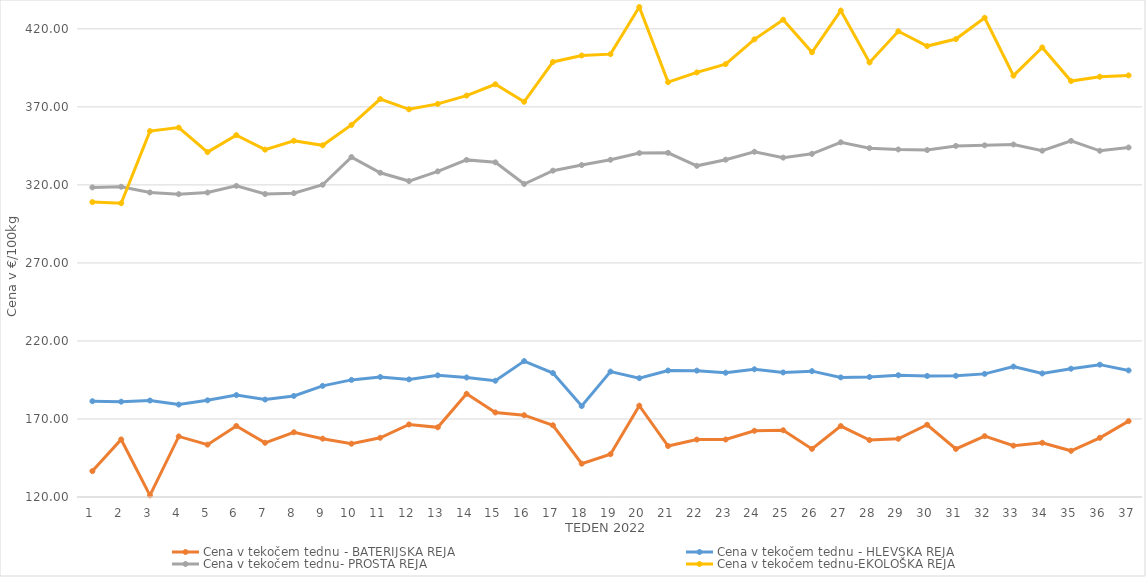
| Category | Cena v tekočem tednu - BATERIJSKA REJA | Cena v tekočem tednu - HLEVSKA REJA | Cena v tekočem tednu- PROSTA REJA | Cena v tekočem tednu-EKOLOŠKA REJA |
|---|---|---|---|---|
| 1.0 | 136.59 | 181.38 | 318.4 | 308.97 |
| 2.0 | 156.88 | 181.07 | 318.82 | 308.28 |
| 3.0 | 121.07 | 181.83 | 315.14 | 354.48 |
| 4.0 | 158.82 | 179.22 | 314.08 | 356.72 |
| 5.0 | 153.55 | 181.96 | 315.1 | 341.03 |
| 6.0 | 165.51 | 185.31 | 319.38 | 351.9 |
| 7.0 | 154.74 | 182.45 | 314.16 | 342.59 |
| 8.0 | 161.48 | 184.77 | 314.71 | 348.28 |
| 9.0 | 157.38 | 191.21 | 320.1 | 345.35 |
| 10.0 | 154.16 | 195.04 | 337.83 | 358.45 |
| 11.0 | 157.96 | 196.88 | 327.79 | 375 |
| 12.0 | 166.49 | 195.36 | 322.46 | 368.45 |
| 13.0 | 164.66 | 197.95 | 328.67 | 371.9 |
| 14.0 | 186.11 | 196.59 | 336.02 | 377.24 |
| 15.0 | 174.18 | 194.49 | 334.46 | 384.48 |
| 16.0 | 172.42 | 207.1 | 320.58 | 373.28 |
| 17.0 | 165.96 | 199.41 | 329.11 | 398.79 |
| 18.0 | 141.36 | 178.29 | 332.71 | 402.93 |
| 19.0 | 147.43 | 200.37 | 336.11 | 403.79 |
| 20.0 | 178.51 | 196.16 | 340.4 | 433.97 |
| 21.0 | 152.67 | 201.05 | 340.55 | 385.86 |
| 22.0 | 156.8 | 200.98 | 332.23 | 392.07 |
| 23.0 | 156.84 | 199.63 | 336.16 | 397.41 |
| 24.0 | 162.44 | 201.86 | 341.24 | 413.28 |
| 25.0 | 162.78 | 199.81 | 337.48 | 425.86 |
| 26.0 | 150.82 | 200.65 | 339.9 | 405 |
| 27.0 | 165.45 | 196.64 | 347.3 | 431.72 |
| 28.0 | 156.46 | 196.88 | 343.56 | 398.45 |
| 29.0 | 157.31 | 198.03 | 342.71 | 418.45 |
| 30.0 | 166.29 | 197.55 | 342.35 | 408.97 |
| 31.0 | 150.81 | 197.66 | 344.97 | 413.45 |
| 32.0 | 158.99 | 198.9 | 345.35 | 427.07 |
| 33.0 | 152.91 | 203.57 | 345.9 | 390 |
| 34.0 | 154.73 | 199.17 | 341.92 | 408.1 |
| 35.0 | 149.6 | 202.21 | 348.2 | 386.55 |
| 36.0 | 157.93 | 204.81 | 341.85 | 389.31 |
| 37.0 | 168.61 | 201.11 | 343.97 | 390.17 |